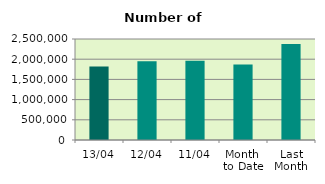
| Category | Series 0 |
|---|---|
| 13/04 | 1818768 |
| 12/04 | 1948610 |
| 11/04 | 1962766 |
| Month 
to Date | 1869570.857 |
| Last
Month | 2375448 |